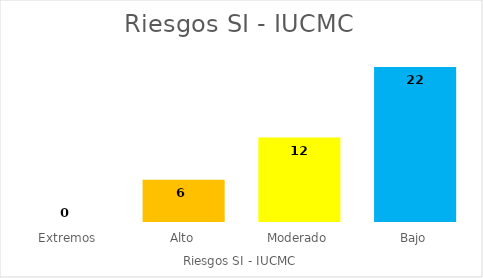
| Category | Riesgos SI - IUCMC |
|---|---|
| 0 | 0 |
| 1 | 6 |
| 2 | 12 |
| 3 | 22 |